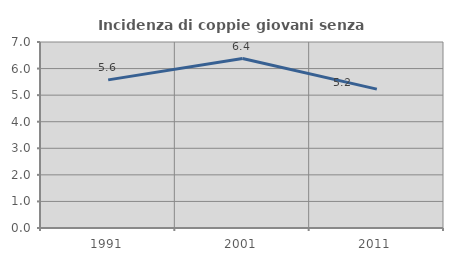
| Category | Incidenza di coppie giovani senza figli |
|---|---|
| 1991.0 | 5.575 |
| 2001.0 | 6.378 |
| 2011.0 | 5.228 |